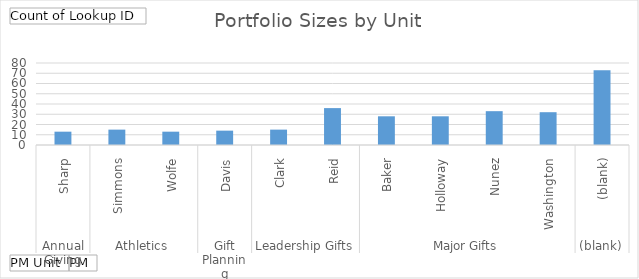
| Category | Total |
|---|---|
| 0 | 13 |
| 1 | 15 |
| 2 | 13 |
| 3 | 14 |
| 4 | 15 |
| 5 | 36 |
| 6 | 28 |
| 7 | 28 |
| 8 | 33 |
| 9 | 32 |
| 10 | 73 |